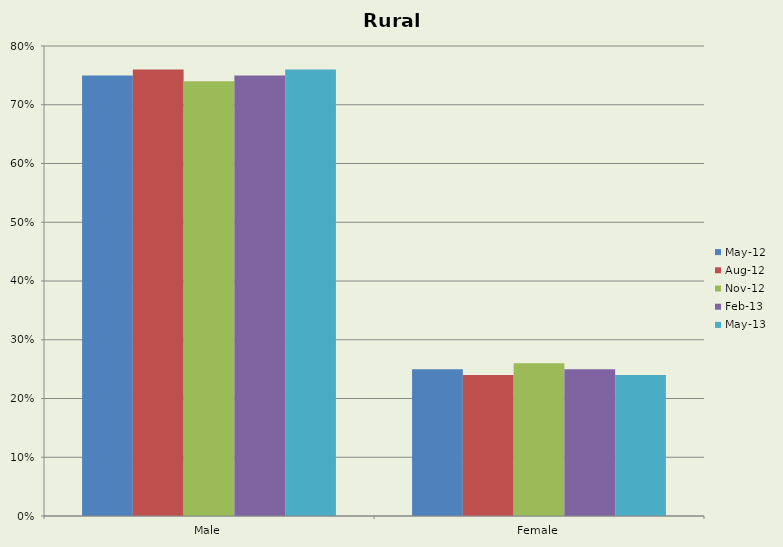
| Category | May-12 | Aug-12 | Nov-12 | Feb-13 | May-13 |
|---|---|---|---|---|---|
| Male | 0.75 | 0.76 | 0.74 | 0.75 | 0.76 |
| Female | 0.25 | 0.24 | 0.26 | 0.25 | 0.24 |